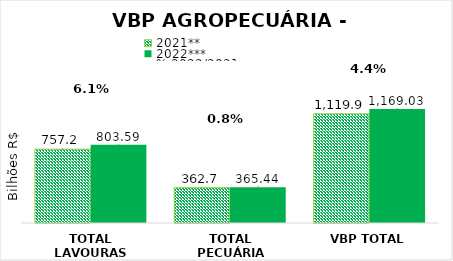
| Category | 2021** | 2022*** |
|---|---|---|
| TOTAL LAVOURAS | 757.227 | 803.586 |
| TOTAL PECUÁRIA | 362.719 | 365.44 |
| VBP TOTAL | 1119.947 | 1169.026 |